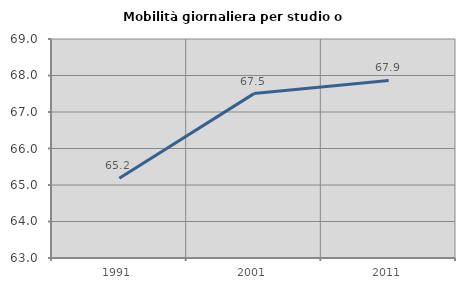
| Category | Mobilità giornaliera per studio o lavoro |
|---|---|
| 1991.0 | 65.185 |
| 2001.0 | 67.504 |
| 2011.0 | 67.864 |